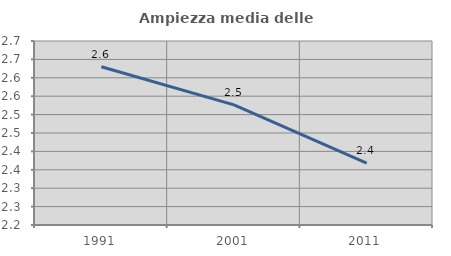
| Category | Ampiezza media delle famiglie |
|---|---|
| 1991.0 | 2.63 |
| 2001.0 | 2.527 |
| 2011.0 | 2.368 |